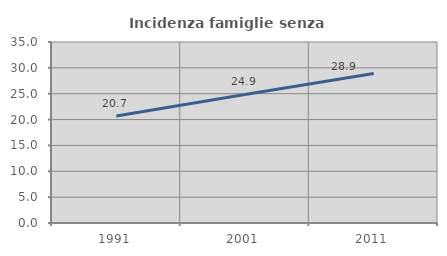
| Category | Incidenza famiglie senza nuclei |
|---|---|
| 1991.0 | 20.693 |
| 2001.0 | 24.867 |
| 2011.0 | 28.893 |